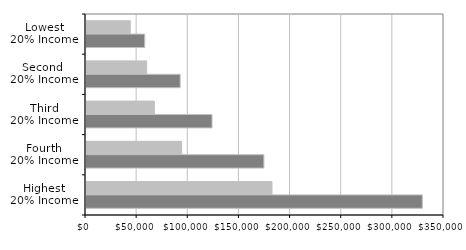
| Category | 2000 | 2010 |
|---|---|---|
| Lowest
20% Income | 43225 | 57423 |
| Second 
20% Income | 59296 | 92064 |
| Third
20% Income | 66851 | 123211 |
| Fourth
20% Income | 93498 | 173902 |
| Highest
20% Income | 181842 | 328790 |